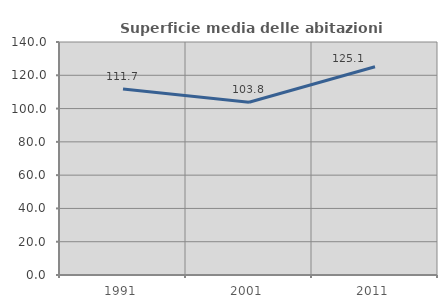
| Category | Superficie media delle abitazioni occupate |
|---|---|
| 1991.0 | 111.726 |
| 2001.0 | 103.758 |
| 2011.0 | 125.137 |